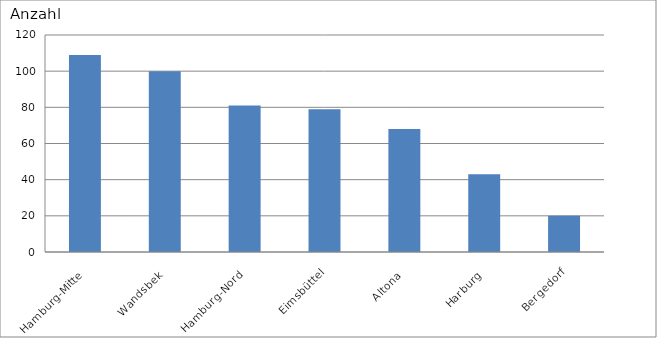
| Category | Hamburg-Mitte Wandsbek Hamburg-Nord Eimsbüttel Altona Harburg Bergedorf |
|---|---|
| Hamburg-Mitte | 109 |
| Wandsbek | 100 |
| Hamburg-Nord | 81 |
| Eimsbüttel | 79 |
| Altona | 68 |
| Harburg | 43 |
| Bergedorf | 20 |